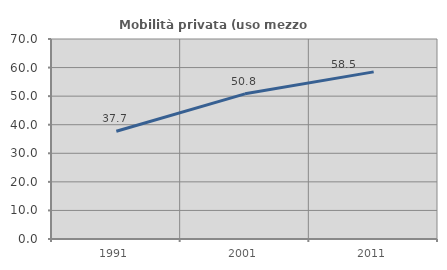
| Category | Mobilità privata (uso mezzo privato) |
|---|---|
| 1991.0 | 37.691 |
| 2001.0 | 50.804 |
| 2011.0 | 58.487 |